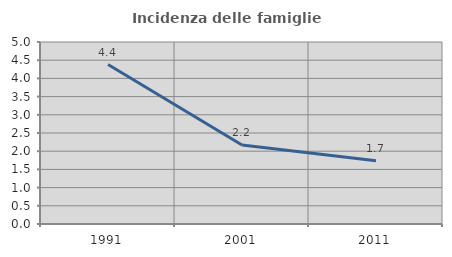
| Category | Incidenza delle famiglie numerose |
|---|---|
| 1991.0 | 4.38 |
| 2001.0 | 2.169 |
| 2011.0 | 1.739 |